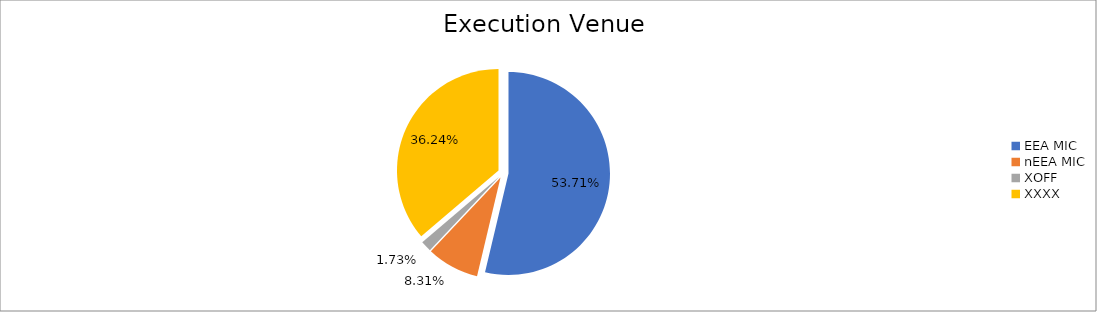
| Category | Series 0 |
|---|---|
| EEA MIC | 6594891.534 |
| nEEA MIC | 1020660.864 |
| XOFF | 212754.83 |
| XXXX | 4449363.288 |